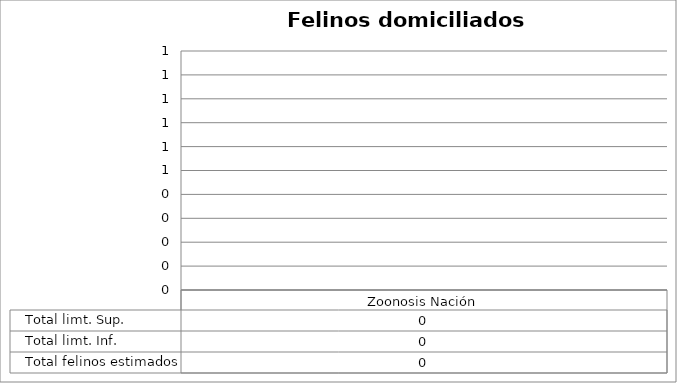
| Category | Total limt. Sup. | Total limt. Inf. | Total felinos estimados |
|---|---|---|---|
| Zoonosis Nación | 0 | 0 | 0 |